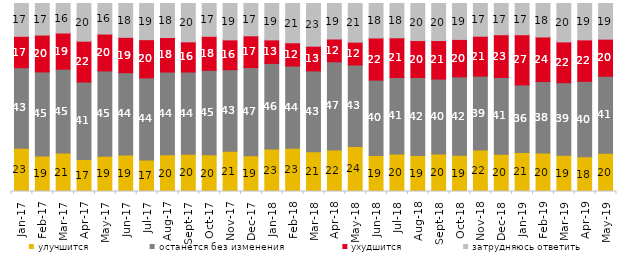
| Category | улучшится | останется без изменения | ухудшится | затрудняюсь ответить |
|---|---|---|---|---|
| 2017-01-01 | 23 | 42.85 | 16.7 | 17.45 |
| 2017-02-01 | 18.85 | 44.75 | 19.6 | 16.8 |
| 2017-03-01 | 20.5 | 44.55 | 19.25 | 15.7 |
| 2017-04-01 | 17 | 41.25 | 21.7 | 20.05 |
| 2017-05-01 | 18.7 | 45.45 | 19.6 | 16.25 |
| 2017-06-01 | 19.4 | 43.8 | 18.8 | 18 |
| 2017-07-01 | 16.7 | 43.75 | 20.3 | 19.25 |
| 2017-08-01 | 19.5 | 44.05 | 18.35 | 18.1 |
| 2017-09-01 | 19.8 | 43.75 | 16.05 | 20.4 |
| 2017-10-01 | 19.55 | 44.9 | 18.1 | 17.45 |
| 2017-11-01 | 21.45 | 43.35 | 15.85 | 19.35 |
| 2017-12-01 | 18.95 | 46.95 | 16.9 | 17.2 |
| 2018-01-01 | 22.55 | 45.6 | 12.5 | 19.35 |
| 2018-02-01 | 23 | 43.75 | 12.35 | 20.9 |
| 2018-03-01 | 21.15 | 43 | 13.15 | 22.7 |
| 2018-04-01 | 22.05 | 46.95 | 12.1 | 18.9 |
| 2018-05-01 | 23.95 | 43.35 | 12.15 | 20.55 |
| 2018-06-01 | 19.15 | 40.1 | 22.4 | 18.35 |
| 2018-07-01 | 19.95 | 40.7 | 21.1 | 18.25 |
| 2018-08-01 | 19.15 | 41.5 | 19.65 | 19.7 |
| 2018-09-01 | 19.95 | 39.85 | 20.5 | 19.7 |
| 2018-10-01 | 19.3 | 41.7 | 19.9 | 19.1 |
| 2018-11-01 | 22.056 | 39.321 | 21.208 | 17.415 |
| 2018-12-01 | 19.8 | 40.85 | 22.75 | 16.6 |
| 2019-01-01 | 20.75 | 35.95 | 26.7 | 16.6 |
| 2019-02-01 | 20.45 | 38.05 | 23.7 | 17.8 |
| 2019-03-01 | 19.344 | 38.538 | 21.681 | 20.438 |
| 2019-04-01 | 18.465 | 40.149 | 22.03 | 19.356 |
| 2019-05-01 | 20.406 | 40.911 | 19.713 | 18.97 |